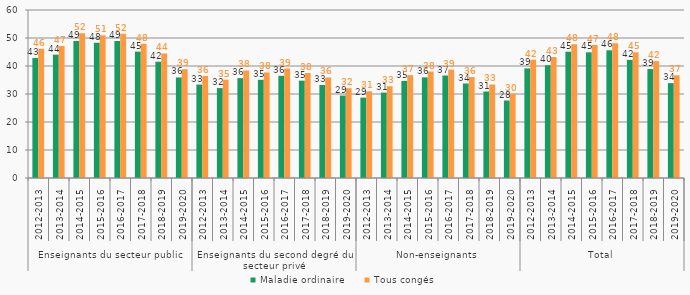
| Category | Maladie ordinaire | Tous congés |
|---|---|---|
| 0 | 42.84 | 46.18 |
| 1 | 44.05 | 47.14 |
| 2 | 48.95 | 51.74 |
| 3 | 48.28 | 50.98 |
| 4 | 48.93 | 51.54 |
| 5 | 45.13 | 47.95 |
| 6 | 41.53 | 44.47 |
| 7 | 35.91 | 38.85 |
| 8 | 33.37 | 36.46 |
| 9 | 32.11 | 35.11 |
| 10 | 35.67 | 38.4 |
| 11 | 35.08 | 37.71 |
| 12 | 36.49 | 39.1 |
| 13 | 34.76 | 37.51 |
| 14 | 33.21 | 35.9 |
| 15 | 29.44 | 32.06 |
| 16 | 28.71 | 30.95 |
| 17 | 30.5 | 32.77 |
| 18 | 34.67 | 36.74 |
| 19 | 35.94 | 38.03 |
| 20 | 36.6 | 38.71 |
| 21 | 33.75 | 36.08 |
| 22 | 30.89 | 33.4 |
| 23 | 27.67 | 30.05 |
| 24 | 39.14 | 42.24 |
| 25 | 40.27 | 43.18 |
| 26 | 45.1 | 47.75 |
| 27 | 44.89 | 47.48 |
| 28 | 45.61 | 48.14 |
| 29 | 42.18 | 44.9 |
| 30 | 38.91 | 41.75 |
| 31 | 33.88 | 36.69 |